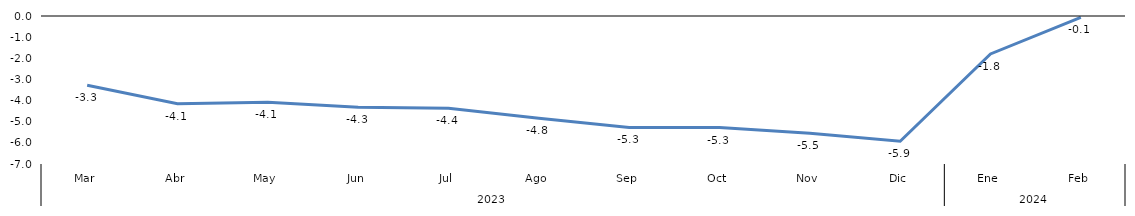
| Category | Bogotá |
|---|---|
| 0 | -3.274 |
| 1 | -4.145 |
| 2 | -4.074 |
| 3 | -4.317 |
| 4 | -4.363 |
| 5 | -4.833 |
| 6 | -5.272 |
| 7 | -5.279 |
| 8 | -5.546 |
| 9 | -5.924 |
| 10 | -1.796 |
| 11 | -0.065 |